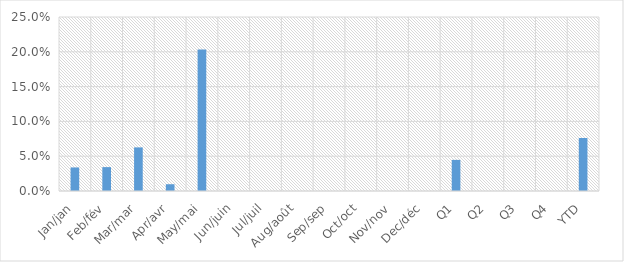
| Category | Total YoY % Change |
|---|---|
| Jan/jan | 0.034 |
| Feb/fév | 0.034 |
| Mar/mar | 0.063 |
| Apr/avr | 0.01 |
| May/mai | 0.203 |
| Jun/juin | 0 |
| Jul/juil | 0 |
| Aug/août | 0 |
| Sep/sep | 0 |
| Oct/oct | 0 |
| Nov/nov | 0 |
| Dec/déc | 0 |
| Q1 | 0.045 |
| Q2 | 0 |
| Q3 | 0 |
| Q4 | 0 |
| YTD | 0.076 |